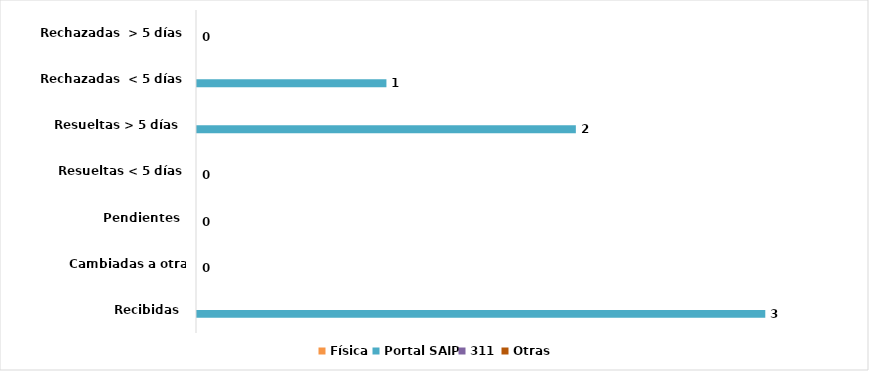
| Category | Física | Portal SAIP | 311 | Otras |
|---|---|---|---|---|
| Recibidas  | 0 | 3 | 0 | 0 |
| Cambiadas a otra Institución | 0 | 0 | 0 | 0 |
| Pendientes  | 0 | 0 | 0 | 0 |
| Resueltas < 5 días | 0 | 0 | 0 | 0 |
| Resueltas > 5 días  | 0 | 2 | 0 | 0 |
| Rechazadas  < 5 días | 0 | 1 | 0 | 0 |
| Rechazadas  > 5 días | 0 | 0 | 0 | 0 |